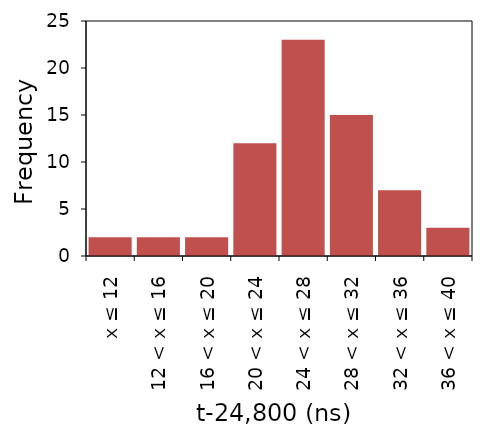
| Category | Series 1 |
|---|---|
| x ≤ 12 | 2 |
| 12 < x ≤ 16 | 2 |
| 16 < x ≤ 20 | 2 |
| 20 < x ≤ 24 | 12 |
| 24 < x ≤ 28 | 23 |
| 28 < x ≤ 32 | 15 |
| 32 < x ≤ 36 | 7 |
| 36 < x ≤ 40 | 3 |